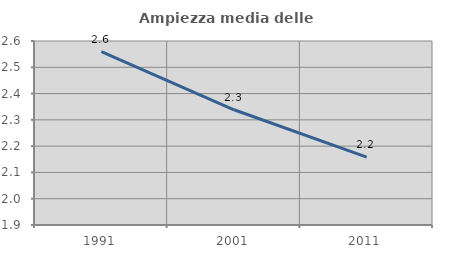
| Category | Ampiezza media delle famiglie |
|---|---|
| 1991.0 | 2.56 |
| 2001.0 | 2.338 |
| 2011.0 | 2.158 |